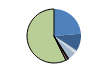
| Category | Series 0 |
|---|---|
| ARRASTRE | 334 |
| CERCO | 145 |
| ATUNEROS CAÑEROS | 6 |
| PALANGRE DE FONDO | 24 |
| PALANGRE DE SUPERFICIE | 61 |
| RASCO | 7 |
| VOLANTA | 9 |
| ARTES FIJAS | 18 |
| ARTES MENORES | 810 |